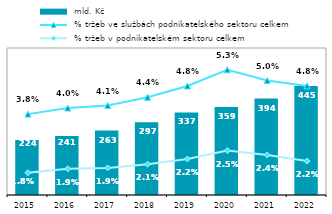
| Category |  mld. Kč |
|---|---|
| 2015.0 | 224.002 |
| 2016.0 | 241.04 |
| 2017.0 | 263.002 |
| 2018.0 | 297.334 |
| 2019.0 | 336.794 |
| 2020.0 | 358.986 |
| 2021.0 | 393.759 |
| 2022.0 | 444.503 |